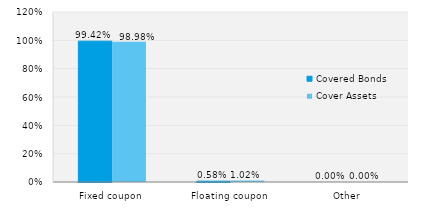
| Category | Covered Bonds | Cover Assets |
|---|---|---|
| Fixed coupon | 0.994 | 0.99 |
| Floating coupon | 0.006 | 0.01 |
| Other | 0 | 0 |